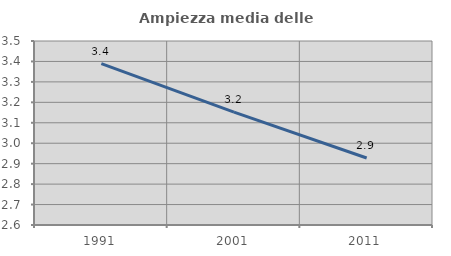
| Category | Ampiezza media delle famiglie |
|---|---|
| 1991.0 | 3.39 |
| 2001.0 | 3.152 |
| 2011.0 | 2.928 |